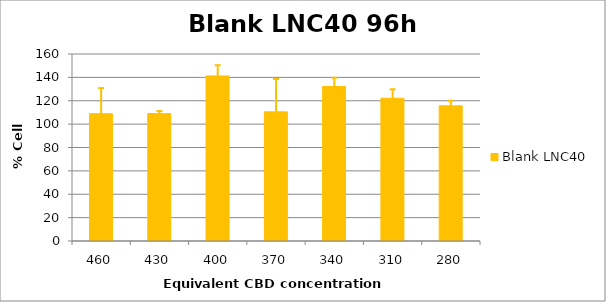
| Category | Blank LNC40 |
|---|---|
| 460.0 | 108.917 |
| 430.0 | 109.005 |
| 400.0 | 141.226 |
| 370.0 | 110.508 |
| 340.0 | 132.132 |
| 310.0 | 122.157 |
| 280.0 | 115.652 |